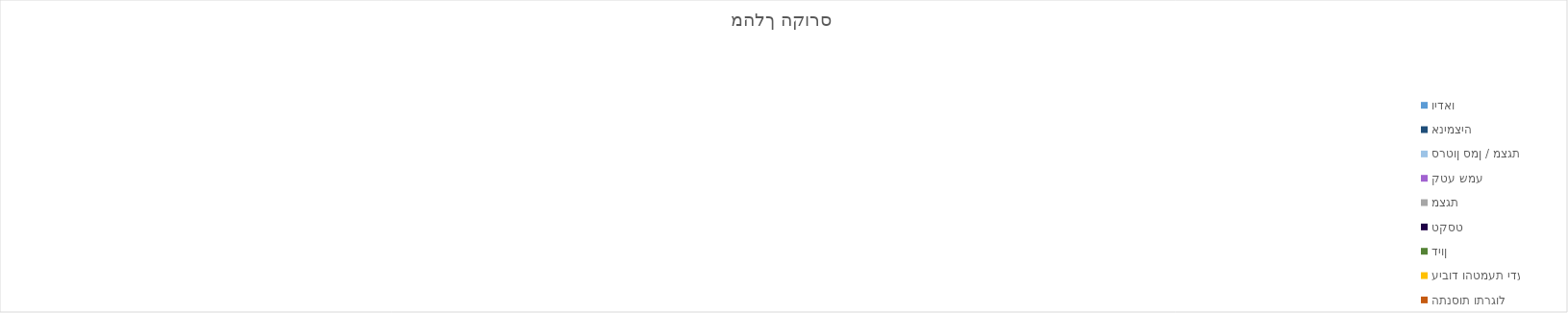
| Category | וידאו | אנימציה | סרטון סמן / מצגת | קטע שמע | מצגת | טקסט | דיון | עיבוד והטמעת ידע | התנסות ותרגול | יצירה |
|---|---|---|---|---|---|---|---|---|---|---|
| 0 | 0 | 0 | 0 | 0 | 0 | 0 | 0 | 0 | 0 | 0 |
| 1 | 0 | 0 | 0 | 0 | 0 | 0 | 0 | 0 | 0 | 0 |
| 2 | 0 | 0 | 0 | 0 | 0 | 0 | 0 | 0 | 0 | 0 |
| 3 | 0 | 0 | 0 | 0 | 0 | 0 | 0 | 0 | 0 | 0 |
| 4 | 0 | 0 | 0 | 0 | 0 | 0 | 0 | 0 | 0 | 0 |
| 5 | 0 | 0 | 0 | 0 | 0 | 0 | 0 | 0 | 0 | 0 |
| 6 | 0 | 0 | 0 | 0 | 0 | 0 | 0 | 0 | 0 | 0 |
| 7 | 0 | 0 | 0 | 0 | 0 | 0 | 0 | 0 | 0 | 0 |
| 8 | 0 | 0 | 0 | 0 | 0 | 0 | 0 | 0 | 0 | 0 |
| 9 | 0 | 0 | 0 | 0 | 0 | 0 | 0 | 0 | 0 | 0 |
| 10 | 0 | 0 | 0 | 0 | 0 | 0 | 0 | 0 | 0 | 0 |
| 11 | 0 | 0 | 0 | 0 | 0 | 0 | 0 | 0 | 0 | 0 |
| 12 | 0 | 0 | 0 | 0 | 0 | 0 | 0 | 0 | 0 | 0 |
| 13 | 0 | 0 | 0 | 0 | 0 | 0 | 0 | 0 | 0 | 0 |
| 14 | 0 | 0 | 0 | 0 | 0 | 0 | 0 | 0 | 0 | 0 |
| 15 | 0 | 0 | 0 | 0 | 0 | 0 | 0 | 0 | 0 | 0 |
| 16 | 0 | 0 | 0 | 0 | 0 | 0 | 0 | 0 | 0 | 0 |
| 17 | 0 | 0 | 0 | 0 | 0 | 0 | 0 | 0 | 0 | 0 |
| 18 | 0 | 0 | 0 | 0 | 0 | 0 | 0 | 0 | 0 | 0 |
| 19 | 0 | 0 | 0 | 0 | 0 | 0 | 0 | 0 | 0 | 0 |
| 20 | 0 | 0 | 0 | 0 | 0 | 0 | 0 | 0 | 0 | 0 |
| 21 | 0 | 0 | 0 | 0 | 0 | 0 | 0 | 0 | 0 | 0 |
| 22 | 0 | 0 | 0 | 0 | 0 | 0 | 0 | 0 | 0 | 0 |
| 23 | 0 | 0 | 0 | 0 | 0 | 0 | 0 | 0 | 0 | 0 |
| 24 | 0 | 0 | 0 | 0 | 0 | 0 | 0 | 0 | 0 | 0 |
| 25 | 0 | 0 | 0 | 0 | 0 | 0 | 0 | 0 | 0 | 0 |
| 26 | 0 | 0 | 0 | 0 | 0 | 0 | 0 | 0 | 0 | 0 |
| 27 | 0 | 0 | 0 | 0 | 0 | 0 | 0 | 0 | 0 | 0 |
| 28 | 0 | 0 | 0 | 0 | 0 | 0 | 0 | 0 | 0 | 0 |
| 29 | 0 | 0 | 0 | 0 | 0 | 0 | 0 | 0 | 0 | 0 |
| 30 | 0 | 0 | 0 | 0 | 0 | 0 | 0 | 0 | 0 | 0 |
| 31 | 0 | 0 | 0 | 0 | 0 | 0 | 0 | 0 | 0 | 0 |
| 32 | 0 | 0 | 0 | 0 | 0 | 0 | 0 | 0 | 0 | 0 |
| 33 | 0 | 0 | 0 | 0 | 0 | 0 | 0 | 0 | 0 | 0 |
| 34 | 0 | 0 | 0 | 0 | 0 | 0 | 0 | 0 | 0 | 0 |
| 35 | 0 | 0 | 0 | 0 | 0 | 0 | 0 | 0 | 0 | 0 |
| 36 | 0 | 0 | 0 | 0 | 0 | 0 | 0 | 0 | 0 | 0 |
| 37 | 0 | 0 | 0 | 0 | 0 | 0 | 0 | 0 | 0 | 0 |
| 38 | 0 | 0 | 0 | 0 | 0 | 0 | 0 | 0 | 0 | 0 |
| 39 | 0 | 0 | 0 | 0 | 0 | 0 | 0 | 0 | 0 | 0 |
| 40 | 0 | 0 | 0 | 0 | 0 | 0 | 0 | 0 | 0 | 0 |
| 41 | 0 | 0 | 0 | 0 | 0 | 0 | 0 | 0 | 0 | 0 |
| 42 | 0 | 0 | 0 | 0 | 0 | 0 | 0 | 0 | 0 | 0 |
| 43 | 0 | 0 | 0 | 0 | 0 | 0 | 0 | 0 | 0 | 0 |
| 44 | 0 | 0 | 0 | 0 | 0 | 0 | 0 | 0 | 0 | 0 |
| 45 | 0 | 0 | 0 | 0 | 0 | 0 | 0 | 0 | 0 | 0 |
| 46 | 0 | 0 | 0 | 0 | 0 | 0 | 0 | 0 | 0 | 0 |
| 47 | 0 | 0 | 0 | 0 | 0 | 0 | 0 | 0 | 0 | 0 |
| 48 | 0 | 0 | 0 | 0 | 0 | 0 | 0 | 0 | 0 | 0 |
| 49 | 0 | 0 | 0 | 0 | 0 | 0 | 0 | 0 | 0 | 0 |
| 50 | 0 | 0 | 0 | 0 | 0 | 0 | 0 | 0 | 0 | 0 |
| 51 | 0 | 0 | 0 | 0 | 0 | 0 | 0 | 0 | 0 | 0 |
| 52 | 0 | 0 | 0 | 0 | 0 | 0 | 0 | 0 | 0 | 0 |
| 53 | 0 | 0 | 0 | 0 | 0 | 0 | 0 | 0 | 0 | 0 |
| 54 | 0 | 0 | 0 | 0 | 0 | 0 | 0 | 0 | 0 | 0 |
| 55 | 0 | 0 | 0 | 0 | 0 | 0 | 0 | 0 | 0 | 0 |
| 56 | 0 | 0 | 0 | 0 | 0 | 0 | 0 | 0 | 0 | 0 |
| 57 | 0 | 0 | 0 | 0 | 0 | 0 | 0 | 0 | 0 | 0 |
| 58 | 0 | 0 | 0 | 0 | 0 | 0 | 0 | 0 | 0 | 0 |
| 59 | 0 | 0 | 0 | 0 | 0 | 0 | 0 | 0 | 0 | 0 |
| 60 | 0 | 0 | 0 | 0 | 0 | 0 | 0 | 0 | 0 | 0 |
| 61 | 0 | 0 | 0 | 0 | 0 | 0 | 0 | 0 | 0 | 0 |
| 62 | 0 | 0 | 0 | 0 | 0 | 0 | 0 | 0 | 0 | 0 |
| 63 | 0 | 0 | 0 | 0 | 0 | 0 | 0 | 0 | 0 | 0 |
| 64 | 0 | 0 | 0 | 0 | 0 | 0 | 0 | 0 | 0 | 0 |
| 65 | 0 | 0 | 0 | 0 | 0 | 0 | 0 | 0 | 0 | 0 |
| 66 | 0 | 0 | 0 | 0 | 0 | 0 | 0 | 0 | 0 | 0 |
| 67 | 0 | 0 | 0 | 0 | 0 | 0 | 0 | 0 | 0 | 0 |
| 68 | 0 | 0 | 0 | 0 | 0 | 0 | 0 | 0 | 0 | 0 |
| 69 | 0 | 0 | 0 | 0 | 0 | 0 | 0 | 0 | 0 | 0 |
| 70 | 0 | 0 | 0 | 0 | 0 | 0 | 0 | 0 | 0 | 0 |
| 71 | 0 | 0 | 0 | 0 | 0 | 0 | 0 | 0 | 0 | 0 |
| 72 | 0 | 0 | 0 | 0 | 0 | 0 | 0 | 0 | 0 | 0 |
| 73 | 0 | 0 | 0 | 0 | 0 | 0 | 0 | 0 | 0 | 0 |
| 74 | 0 | 0 | 0 | 0 | 0 | 0 | 0 | 0 | 0 | 0 |
| 75 | 0 | 0 | 0 | 0 | 0 | 0 | 0 | 0 | 0 | 0 |
| 76 | 0 | 0 | 0 | 0 | 0 | 0 | 0 | 0 | 0 | 0 |
| 77 | 0 | 0 | 0 | 0 | 0 | 0 | 0 | 0 | 0 | 0 |
| 78 | 0 | 0 | 0 | 0 | 0 | 0 | 0 | 0 | 0 | 0 |
| 79 | 0 | 0 | 0 | 0 | 0 | 0 | 0 | 0 | 0 | 0 |
| 80 | 0 | 0 | 0 | 0 | 0 | 0 | 0 | 0 | 0 | 0 |
| 81 | 0 | 0 | 0 | 0 | 0 | 0 | 0 | 0 | 0 | 0 |
| 82 | 0 | 0 | 0 | 0 | 0 | 0 | 0 | 0 | 0 | 0 |
| 83 | 0 | 0 | 0 | 0 | 0 | 0 | 0 | 0 | 0 | 0 |
| 84 | 0 | 0 | 0 | 0 | 0 | 0 | 0 | 0 | 0 | 0 |
| 85 | 0 | 0 | 0 | 0 | 0 | 0 | 0 | 0 | 0 | 0 |
| 86 | 0 | 0 | 0 | 0 | 0 | 0 | 0 | 0 | 0 | 0 |
| 87 | 0 | 0 | 0 | 0 | 0 | 0 | 0 | 0 | 0 | 0 |
| 88 | 0 | 0 | 0 | 0 | 0 | 0 | 0 | 0 | 0 | 0 |
| 89 | 0 | 0 | 0 | 0 | 0 | 0 | 0 | 0 | 0 | 0 |
| 90 | 0 | 0 | 0 | 0 | 0 | 0 | 0 | 0 | 0 | 0 |
| 91 | 0 | 0 | 0 | 0 | 0 | 0 | 0 | 0 | 0 | 0 |
| 92 | 0 | 0 | 0 | 0 | 0 | 0 | 0 | 0 | 0 | 0 |
| 93 | 0 | 0 | 0 | 0 | 0 | 0 | 0 | 0 | 0 | 0 |
| 94 | 0 | 0 | 0 | 0 | 0 | 0 | 0 | 0 | 0 | 0 |
| 95 | 0 | 0 | 0 | 0 | 0 | 0 | 0 | 0 | 0 | 0 |
| 96 | 0 | 0 | 0 | 0 | 0 | 0 | 0 | 0 | 0 | 0 |
| 97 | 0 | 0 | 0 | 0 | 0 | 0 | 0 | 0 | 0 | 0 |
| 98 | 0 | 0 | 0 | 0 | 0 | 0 | 0 | 0 | 0 | 0 |
| 99 | 0 | 0 | 0 | 0 | 0 | 0 | 0 | 0 | 0 | 0 |
| 100 | 0 | 0 | 0 | 0 | 0 | 0 | 0 | 0 | 0 | 0 |
| 101 | 0 | 0 | 0 | 0 | 0 | 0 | 0 | 0 | 0 | 0 |
| 102 | 0 | 0 | 0 | 0 | 0 | 0 | 0 | 0 | 0 | 0 |
| 103 | 0 | 0 | 0 | 0 | 0 | 0 | 0 | 0 | 0 | 0 |
| 104 | 0 | 0 | 0 | 0 | 0 | 0 | 0 | 0 | 0 | 0 |
| 105 | 0 | 0 | 0 | 0 | 0 | 0 | 0 | 0 | 0 | 0 |
| 106 | 0 | 0 | 0 | 0 | 0 | 0 | 0 | 0 | 0 | 0 |
| 107 | 0 | 0 | 0 | 0 | 0 | 0 | 0 | 0 | 0 | 0 |
| 108 | 0 | 0 | 0 | 0 | 0 | 0 | 0 | 0 | 0 | 0 |
| 109 | 0 | 0 | 0 | 0 | 0 | 0 | 0 | 0 | 0 | 0 |
| 110 | 0 | 0 | 0 | 0 | 0 | 0 | 0 | 0 | 0 | 0 |
| 111 | 0 | 0 | 0 | 0 | 0 | 0 | 0 | 0 | 0 | 0 |
| 112 | 0 | 0 | 0 | 0 | 0 | 0 | 0 | 0 | 0 | 0 |
| 113 | 0 | 0 | 0 | 0 | 0 | 0 | 0 | 0 | 0 | 0 |
| 114 | 0 | 0 | 0 | 0 | 0 | 0 | 0 | 0 | 0 | 0 |
| 115 | 0 | 0 | 0 | 0 | 0 | 0 | 0 | 0 | 0 | 0 |
| 116 | 0 | 0 | 0 | 0 | 0 | 0 | 0 | 0 | 0 | 0 |
| 117 | 0 | 0 | 0 | 0 | 0 | 0 | 0 | 0 | 0 | 0 |
| 118 | 0 | 0 | 0 | 0 | 0 | 0 | 0 | 0 | 0 | 0 |
| 119 | 0 | 0 | 0 | 0 | 0 | 0 | 0 | 0 | 0 | 0 |
| 120 | 0 | 0 | 0 | 0 | 0 | 0 | 0 | 0 | 0 | 0 |
| 121 | 0 | 0 | 0 | 0 | 0 | 0 | 0 | 0 | 0 | 0 |
| 122 | 0 | 0 | 0 | 0 | 0 | 0 | 0 | 0 | 0 | 0 |
| 123 | 0 | 0 | 0 | 0 | 0 | 0 | 0 | 0 | 0 | 0 |
| 124 | 0 | 0 | 0 | 0 | 0 | 0 | 0 | 0 | 0 | 0 |
| 125 | 0 | 0 | 0 | 0 | 0 | 0 | 0 | 0 | 0 | 0 |
| 126 | 0 | 0 | 0 | 0 | 0 | 0 | 0 | 0 | 0 | 0 |
| 127 | 0 | 0 | 0 | 0 | 0 | 0 | 0 | 0 | 0 | 0 |
| 128 | 0 | 0 | 0 | 0 | 0 | 0 | 0 | 0 | 0 | 0 |
| 129 | 0 | 0 | 0 | 0 | 0 | 0 | 0 | 0 | 0 | 0 |
| 130 | 0 | 0 | 0 | 0 | 0 | 0 | 0 | 0 | 0 | 0 |
| 131 | 0 | 0 | 0 | 0 | 0 | 0 | 0 | 0 | 0 | 0 |
| 132 | 0 | 0 | 0 | 0 | 0 | 0 | 0 | 0 | 0 | 0 |
| 133 | 0 | 0 | 0 | 0 | 0 | 0 | 0 | 0 | 0 | 0 |
| 134 | 0 | 0 | 0 | 0 | 0 | 0 | 0 | 0 | 0 | 0 |
| 135 | 0 | 0 | 0 | 0 | 0 | 0 | 0 | 0 | 0 | 0 |
| 136 | 0 | 0 | 0 | 0 | 0 | 0 | 0 | 0 | 0 | 0 |
| 137 | 0 | 0 | 0 | 0 | 0 | 0 | 0 | 0 | 0 | 0 |
| 138 | 0 | 0 | 0 | 0 | 0 | 0 | 0 | 0 | 0 | 0 |
| 139 | 0 | 0 | 0 | 0 | 0 | 0 | 0 | 0 | 0 | 0 |
| 140 | 0 | 0 | 0 | 0 | 0 | 0 | 0 | 0 | 0 | 0 |
| 141 | 0 | 0 | 0 | 0 | 0 | 0 | 0 | 0 | 0 | 0 |
| 142 | 0 | 0 | 0 | 0 | 0 | 0 | 0 | 0 | 0 | 0 |
| 143 | 0 | 0 | 0 | 0 | 0 | 0 | 0 | 0 | 0 | 0 |
| 144 | 0 | 0 | 0 | 0 | 0 | 0 | 0 | 0 | 0 | 0 |
| 145 | 0 | 0 | 0 | 0 | 0 | 0 | 0 | 0 | 0 | 0 |
| 146 | 0 | 0 | 0 | 0 | 0 | 0 | 0 | 0 | 0 | 0 |
| 147 | 0 | 0 | 0 | 0 | 0 | 0 | 0 | 0 | 0 | 0 |
| 148 | 0 | 0 | 0 | 0 | 0 | 0 | 0 | 0 | 0 | 0 |
| 149 | 0 | 0 | 0 | 0 | 0 | 0 | 0 | 0 | 0 | 0 |
| 150 | 0 | 0 | 0 | 0 | 0 | 0 | 0 | 0 | 0 | 0 |
| 151 | 0 | 0 | 0 | 0 | 0 | 0 | 0 | 0 | 0 | 0 |
| 152 | 0 | 0 | 0 | 0 | 0 | 0 | 0 | 0 | 0 | 0 |
| 153 | 0 | 0 | 0 | 0 | 0 | 0 | 0 | 0 | 0 | 0 |
| 154 | 0 | 0 | 0 | 0 | 0 | 0 | 0 | 0 | 0 | 0 |
| 155 | 0 | 0 | 0 | 0 | 0 | 0 | 0 | 0 | 0 | 0 |
| 156 | 0 | 0 | 0 | 0 | 0 | 0 | 0 | 0 | 0 | 0 |
| 157 | 0 | 0 | 0 | 0 | 0 | 0 | 0 | 0 | 0 | 0 |
| 158 | 0 | 0 | 0 | 0 | 0 | 0 | 0 | 0 | 0 | 0 |
| 159 | 0 | 0 | 0 | 0 | 0 | 0 | 0 | 0 | 0 | 0 |
| 160 | 0 | 0 | 0 | 0 | 0 | 0 | 0 | 0 | 0 | 0 |
| 161 | 0 | 0 | 0 | 0 | 0 | 0 | 0 | 0 | 0 | 0 |
| 162 | 0 | 0 | 0 | 0 | 0 | 0 | 0 | 0 | 0 | 0 |
| 163 | 0 | 0 | 0 | 0 | 0 | 0 | 0 | 0 | 0 | 0 |
| 164 | 0 | 0 | 0 | 0 | 0 | 0 | 0 | 0 | 0 | 0 |
| 165 | 0 | 0 | 0 | 0 | 0 | 0 | 0 | 0 | 0 | 0 |
| 166 | 0 | 0 | 0 | 0 | 0 | 0 | 0 | 0 | 0 | 0 |
| 167 | 0 | 0 | 0 | 0 | 0 | 0 | 0 | 0 | 0 | 0 |
| 168 | 0 | 0 | 0 | 0 | 0 | 0 | 0 | 0 | 0 | 0 |
| 169 | 0 | 0 | 0 | 0 | 0 | 0 | 0 | 0 | 0 | 0 |
| 170 | 0 | 0 | 0 | 0 | 0 | 0 | 0 | 0 | 0 | 0 |
| 171 | 0 | 0 | 0 | 0 | 0 | 0 | 0 | 0 | 0 | 0 |
| 172 | 0 | 0 | 0 | 0 | 0 | 0 | 0 | 0 | 0 | 0 |
| 173 | 0 | 0 | 0 | 0 | 0 | 0 | 0 | 0 | 0 | 0 |
| 174 | 0 | 0 | 0 | 0 | 0 | 0 | 0 | 0 | 0 | 0 |
| 175 | 0 | 0 | 0 | 0 | 0 | 0 | 0 | 0 | 0 | 0 |
| 176 | 0 | 0 | 0 | 0 | 0 | 0 | 0 | 0 | 0 | 0 |
| 177 | 0 | 0 | 0 | 0 | 0 | 0 | 0 | 0 | 0 | 0 |
| 178 | 0 | 0 | 0 | 0 | 0 | 0 | 0 | 0 | 0 | 0 |
| 179 | 0 | 0 | 0 | 0 | 0 | 0 | 0 | 0 | 0 | 0 |
| 180 | 0 | 0 | 0 | 0 | 0 | 0 | 0 | 0 | 0 | 0 |
| 181 | 0 | 0 | 0 | 0 | 0 | 0 | 0 | 0 | 0 | 0 |
| 182 | 0 | 0 | 0 | 0 | 0 | 0 | 0 | 0 | 0 | 0 |
| 183 | 0 | 0 | 0 | 0 | 0 | 0 | 0 | 0 | 0 | 0 |
| 184 | 0 | 0 | 0 | 0 | 0 | 0 | 0 | 0 | 0 | 0 |
| 185 | 0 | 0 | 0 | 0 | 0 | 0 | 0 | 0 | 0 | 0 |
| 186 | 0 | 0 | 0 | 0 | 0 | 0 | 0 | 0 | 0 | 0 |
| 187 | 0 | 0 | 0 | 0 | 0 | 0 | 0 | 0 | 0 | 0 |
| 188 | 0 | 0 | 0 | 0 | 0 | 0 | 0 | 0 | 0 | 0 |
| 189 | 0 | 0 | 0 | 0 | 0 | 0 | 0 | 0 | 0 | 0 |
| 190 | 0 | 0 | 0 | 0 | 0 | 0 | 0 | 0 | 0 | 0 |
| 191 | 0 | 0 | 0 | 0 | 0 | 0 | 0 | 0 | 0 | 0 |
| 192 | 0 | 0 | 0 | 0 | 0 | 0 | 0 | 0 | 0 | 0 |
| 193 | 0 | 0 | 0 | 0 | 0 | 0 | 0 | 0 | 0 | 0 |
| 194 | 0 | 0 | 0 | 0 | 0 | 0 | 0 | 0 | 0 | 0 |
| 195 | 0 | 0 | 0 | 0 | 0 | 0 | 0 | 0 | 0 | 0 |
| 196 | 0 | 0 | 0 | 0 | 0 | 0 | 0 | 0 | 0 | 0 |
| 197 | 0 | 0 | 0 | 0 | 0 | 0 | 0 | 0 | 0 | 0 |
| 198 | 0 | 0 | 0 | 0 | 0 | 0 | 0 | 0 | 0 | 0 |
| 199 | 0 | 0 | 0 | 0 | 0 | 0 | 0 | 0 | 0 | 0 |
| 200 | 0 | 0 | 0 | 0 | 0 | 0 | 0 | 0 | 0 | 0 |
| 201 | 0 | 0 | 0 | 0 | 0 | 0 | 0 | 0 | 0 | 0 |
| 202 | 0 | 0 | 0 | 0 | 0 | 0 | 0 | 0 | 0 | 0 |
| 203 | 0 | 0 | 0 | 0 | 0 | 0 | 0 | 0 | 0 | 0 |
| 204 | 0 | 0 | 0 | 0 | 0 | 0 | 0 | 0 | 0 | 0 |
| 205 | 0 | 0 | 0 | 0 | 0 | 0 | 0 | 0 | 0 | 0 |
| 206 | 0 | 0 | 0 | 0 | 0 | 0 | 0 | 0 | 0 | 0 |
| 207 | 0 | 0 | 0 | 0 | 0 | 0 | 0 | 0 | 0 | 0 |
| 208 | 0 | 0 | 0 | 0 | 0 | 0 | 0 | 0 | 0 | 0 |
| 209 | 0 | 0 | 0 | 0 | 0 | 0 | 0 | 0 | 0 | 0 |
| 210 | 0 | 0 | 0 | 0 | 0 | 0 | 0 | 0 | 0 | 0 |
| 211 | 0 | 0 | 0 | 0 | 0 | 0 | 0 | 0 | 0 | 0 |
| 212 | 0 | 0 | 0 | 0 | 0 | 0 | 0 | 0 | 0 | 0 |
| 213 | 0 | 0 | 0 | 0 | 0 | 0 | 0 | 0 | 0 | 0 |
| 214 | 0 | 0 | 0 | 0 | 0 | 0 | 0 | 0 | 0 | 0 |
| 215 | 0 | 0 | 0 | 0 | 0 | 0 | 0 | 0 | 0 | 0 |
| 216 | 0 | 0 | 0 | 0 | 0 | 0 | 0 | 0 | 0 | 0 |
| 217 | 0 | 0 | 0 | 0 | 0 | 0 | 0 | 0 | 0 | 0 |
| 218 | 0 | 0 | 0 | 0 | 0 | 0 | 0 | 0 | 0 | 0 |
| 219 | 0 | 0 | 0 | 0 | 0 | 0 | 0 | 0 | 0 | 0 |
| 220 | 0 | 0 | 0 | 0 | 0 | 0 | 0 | 0 | 0 | 0 |
| 221 | 0 | 0 | 0 | 0 | 0 | 0 | 0 | 0 | 0 | 0 |
| 222 | 0 | 0 | 0 | 0 | 0 | 0 | 0 | 0 | 0 | 0 |
| 223 | 0 | 0 | 0 | 0 | 0 | 0 | 0 | 0 | 0 | 0 |
| 224 | 0 | 0 | 0 | 0 | 0 | 0 | 0 | 0 | 0 | 0 |
| 225 | 0 | 0 | 0 | 0 | 0 | 0 | 0 | 0 | 0 | 0 |
| 226 | 0 | 0 | 0 | 0 | 0 | 0 | 0 | 0 | 0 | 0 |
| 227 | 0 | 0 | 0 | 0 | 0 | 0 | 0 | 0 | 0 | 0 |
| 228 | 0 | 0 | 0 | 0 | 0 | 0 | 0 | 0 | 0 | 0 |
| 229 | 0 | 0 | 0 | 0 | 0 | 0 | 0 | 0 | 0 | 0 |
| 230 | 0 | 0 | 0 | 0 | 0 | 0 | 0 | 0 | 0 | 0 |
| 231 | 0 | 0 | 0 | 0 | 0 | 0 | 0 | 0 | 0 | 0 |
| 232 | 0 | 0 | 0 | 0 | 0 | 0 | 0 | 0 | 0 | 0 |
| 233 | 0 | 0 | 0 | 0 | 0 | 0 | 0 | 0 | 0 | 0 |
| 234 | 0 | 0 | 0 | 0 | 0 | 0 | 0 | 0 | 0 | 0 |
| 235 | 0 | 0 | 0 | 0 | 0 | 0 | 0 | 0 | 0 | 0 |
| 236 | 0 | 0 | 0 | 0 | 0 | 0 | 0 | 0 | 0 | 0 |
| 237 | 0 | 0 | 0 | 0 | 0 | 0 | 0 | 0 | 0 | 0 |
| 238 | 0 | 0 | 0 | 0 | 0 | 0 | 0 | 0 | 0 | 0 |
| 239 | 0 | 0 | 0 | 0 | 0 | 0 | 0 | 0 | 0 | 0 |
| 240 | 0 | 0 | 0 | 0 | 0 | 0 | 0 | 0 | 0 | 0 |
| 241 | 0 | 0 | 0 | 0 | 0 | 0 | 0 | 0 | 0 | 0 |
| 242 | 0 | 0 | 0 | 0 | 0 | 0 | 0 | 0 | 0 | 0 |
| 243 | 0 | 0 | 0 | 0 | 0 | 0 | 0 | 0 | 0 | 0 |
| 244 | 0 | 0 | 0 | 0 | 0 | 0 | 0 | 0 | 0 | 0 |
| 245 | 0 | 0 | 0 | 0 | 0 | 0 | 0 | 0 | 0 | 0 |
| 246 | 0 | 0 | 0 | 0 | 0 | 0 | 0 | 0 | 0 | 0 |
| 247 | 0 | 0 | 0 | 0 | 0 | 0 | 0 | 0 | 0 | 0 |
| 248 | 0 | 0 | 0 | 0 | 0 | 0 | 0 | 0 | 0 | 0 |
| 249 | 0 | 0 | 0 | 0 | 0 | 0 | 0 | 0 | 0 | 0 |
| 250 | 0 | 0 | 0 | 0 | 0 | 0 | 0 | 0 | 0 | 0 |
| 251 | 0 | 0 | 0 | 0 | 0 | 0 | 0 | 0 | 0 | 0 |
| 252 | 0 | 0 | 0 | 0 | 0 | 0 | 0 | 0 | 0 | 0 |
| 253 | 0 | 0 | 0 | 0 | 0 | 0 | 0 | 0 | 0 | 0 |
| 254 | 0 | 0 | 0 | 0 | 0 | 0 | 0 | 0 | 0 | 0 |
| 255 | 0 | 0 | 0 | 0 | 0 | 0 | 0 | 0 | 0 | 0 |
| 256 | 0 | 0 | 0 | 0 | 0 | 0 | 0 | 0 | 0 | 0 |
| 257 | 0 | 0 | 0 | 0 | 0 | 0 | 0 | 0 | 0 | 0 |
| 258 | 0 | 0 | 0 | 0 | 0 | 0 | 0 | 0 | 0 | 0 |
| 259 | 0 | 0 | 0 | 0 | 0 | 0 | 0 | 0 | 0 | 0 |
| 260 | 0 | 0 | 0 | 0 | 0 | 0 | 0 | 0 | 0 | 0 |
| 261 | 0 | 0 | 0 | 0 | 0 | 0 | 0 | 0 | 0 | 0 |
| 262 | 0 | 0 | 0 | 0 | 0 | 0 | 0 | 0 | 0 | 0 |
| 263 | 0 | 0 | 0 | 0 | 0 | 0 | 0 | 0 | 0 | 0 |
| 264 | 0 | 0 | 0 | 0 | 0 | 0 | 0 | 0 | 0 | 0 |
| 265 | 0 | 0 | 0 | 0 | 0 | 0 | 0 | 0 | 0 | 0 |
| 266 | 0 | 0 | 0 | 0 | 0 | 0 | 0 | 0 | 0 | 0 |
| 267 | 0 | 0 | 0 | 0 | 0 | 0 | 0 | 0 | 0 | 0 |
| 268 | 0 | 0 | 0 | 0 | 0 | 0 | 0 | 0 | 0 | 0 |
| 269 | 0 | 0 | 0 | 0 | 0 | 0 | 0 | 0 | 0 | 0 |
| 270 | 0 | 0 | 0 | 0 | 0 | 0 | 0 | 0 | 0 | 0 |
| 271 | 0 | 0 | 0 | 0 | 0 | 0 | 0 | 0 | 0 | 0 |
| 272 | 0 | 0 | 0 | 0 | 0 | 0 | 0 | 0 | 0 | 0 |
| 273 | 0 | 0 | 0 | 0 | 0 | 0 | 0 | 0 | 0 | 0 |
| 274 | 0 | 0 | 0 | 0 | 0 | 0 | 0 | 0 | 0 | 0 |
| 275 | 0 | 0 | 0 | 0 | 0 | 0 | 0 | 0 | 0 | 0 |
| 276 | 0 | 0 | 0 | 0 | 0 | 0 | 0 | 0 | 0 | 0 |
| 277 | 0 | 0 | 0 | 0 | 0 | 0 | 0 | 0 | 0 | 0 |
| 278 | 0 | 0 | 0 | 0 | 0 | 0 | 0 | 0 | 0 | 0 |
| 279 | 0 | 0 | 0 | 0 | 0 | 0 | 0 | 0 | 0 | 0 |
| 280 | 0 | 0 | 0 | 0 | 0 | 0 | 0 | 0 | 0 | 0 |
| 281 | 0 | 0 | 0 | 0 | 0 | 0 | 0 | 0 | 0 | 0 |
| 282 | 0 | 0 | 0 | 0 | 0 | 0 | 0 | 0 | 0 | 0 |
| 283 | 0 | 0 | 0 | 0 | 0 | 0 | 0 | 0 | 0 | 0 |
| 284 | 0 | 0 | 0 | 0 | 0 | 0 | 0 | 0 | 0 | 0 |
| 285 | 0 | 0 | 0 | 0 | 0 | 0 | 0 | 0 | 0 | 0 |
| 286 | 0 | 0 | 0 | 0 | 0 | 0 | 0 | 0 | 0 | 0 |
| 287 | 0 | 0 | 0 | 0 | 0 | 0 | 0 | 0 | 0 | 0 |
| 288 | 0 | 0 | 0 | 0 | 0 | 0 | 0 | 0 | 0 | 0 |
| 289 | 0 | 0 | 0 | 0 | 0 | 0 | 0 | 0 | 0 | 0 |
| 290 | 0 | 0 | 0 | 0 | 0 | 0 | 0 | 0 | 0 | 0 |
| 291 | 0 | 0 | 0 | 0 | 0 | 0 | 0 | 0 | 0 | 0 |
| 292 | 0 | 0 | 0 | 0 | 0 | 0 | 0 | 0 | 0 | 0 |
| 293 | 0 | 0 | 0 | 0 | 0 | 0 | 0 | 0 | 0 | 0 |
| 294 | 0 | 0 | 0 | 0 | 0 | 0 | 0 | 0 | 0 | 0 |
| 295 | 0 | 0 | 0 | 0 | 0 | 0 | 0 | 0 | 0 | 0 |
| 296 | 0 | 0 | 0 | 0 | 0 | 0 | 0 | 0 | 0 | 0 |
| 297 | 0 | 0 | 0 | 0 | 0 | 0 | 0 | 0 | 0 | 0 |